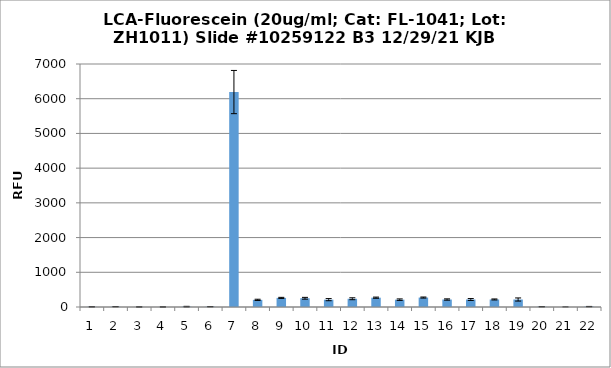
| Category | Series 0 |
|---|---|
| 0 | 5.25 |
| 1 | 9.25 |
| 2 | 2 |
| 3 | 1.5 |
| 4 | 10.25 |
| 5 | 9 |
| 6 | 6191.75 |
| 7 | 205.75 |
| 8 | 262.5 |
| 9 | 251.75 |
| 10 | 211.5 |
| 11 | 237.5 |
| 12 | 268.25 |
| 13 | 211.5 |
| 14 | 272 |
| 15 | 215.25 |
| 16 | 216 |
| 17 | 216.75 |
| 18 | 215.75 |
| 19 | 7.75 |
| 20 | 1 |
| 21 | 11.5 |